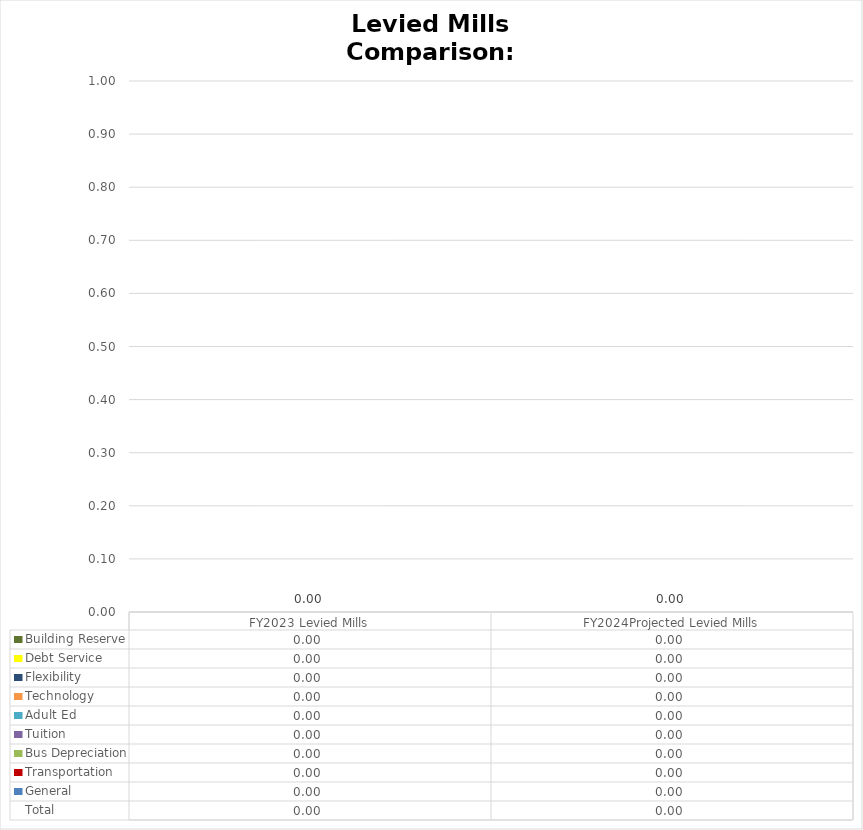
| Category |  General  |  Transportation  |  Bus Depreciation  |  Tuition  |  Adult Ed  |  Technology  |  Flexibility  |  Debt Service  |  Building Reserve  |
|---|---|---|---|---|---|---|---|---|---|
| FY2023 Levied Mills | 0 | 0 | 0 | 0 | 0 | 0 | 0 | 0 | 0 |
|  FY2024Projected Levied Mills  | 0 | 0 | 0 | 0 | 0 | 0 | 0 | 0 | 0 |